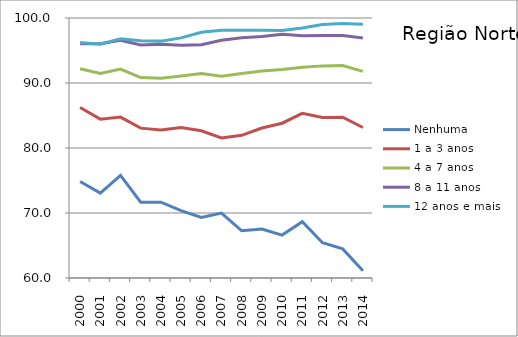
| Category | Nenhuma | 1 a 3 anos | 4 a 7 anos | 8 a 11 anos | 12 anos e mais |
|---|---|---|---|---|---|
| 2000.0 | 74.835 | 86.226 | 92.188 | 96.031 | 96.219 |
| 2001.0 | 73.064 | 84.44 | 91.462 | 96.032 | 95.977 |
| 2002.0 | 75.79 | 84.751 | 92.151 | 96.582 | 96.815 |
| 2003.0 | 71.658 | 83.057 | 90.835 | 95.861 | 96.512 |
| 2004.0 | 71.668 | 82.773 | 90.738 | 95.953 | 96.443 |
| 2005.0 | 70.352 | 83.143 | 91.088 | 95.8 | 96.94 |
| 2006.0 | 69.327 | 82.65 | 91.474 | 95.9 | 97.795 |
| 2007.0 | 69.995 | 81.551 | 91.025 | 96.58 | 98.116 |
| 2008.0 | 67.265 | 81.948 | 91.472 | 96.972 | 98.134 |
| 2009.0 | 67.533 | 83.078 | 91.847 | 97.169 | 98.123 |
| 2010.0 | 66.602 | 83.814 | 92.077 | 97.482 | 98.083 |
| 2011.0 | 68.645 | 85.334 | 92.439 | 97.251 | 98.447 |
| 2012.0 | 65.432 | 84.705 | 92.634 | 97.324 | 99.004 |
| 2013.0 | 64.48 | 84.745 | 92.68 | 97.3 | 99.146 |
| 2014.0 | 61.109 | 83.154 | 91.785 | 96.911 | 99.047 |